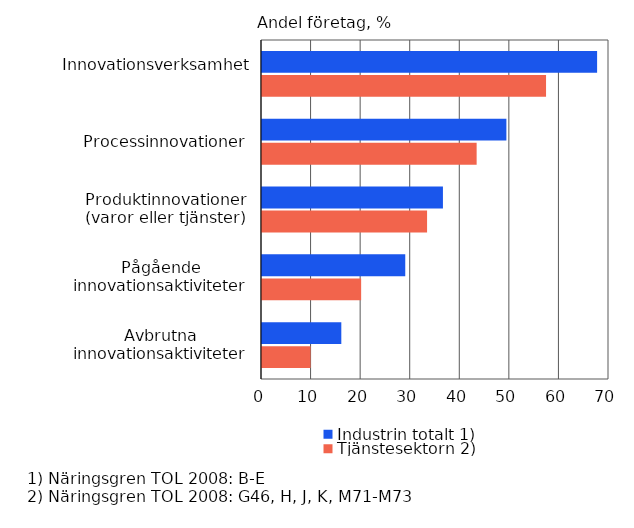
| Category | Industrin totalt 1) | Tjänstesektorn 2) |
|---|---|---|
| Innovationsverksamhet | 67.6 | 57.3 |
| Processinnovationer | 49.3 | 43.3 |
| Produktinnovationer (varor eller tjänster) | 36.5 | 33.3 |
| Pågående innovationsaktiviteter | 28.9 | 20 |
| Avbrutna innovationsaktiviteter | 16 | 9.8 |